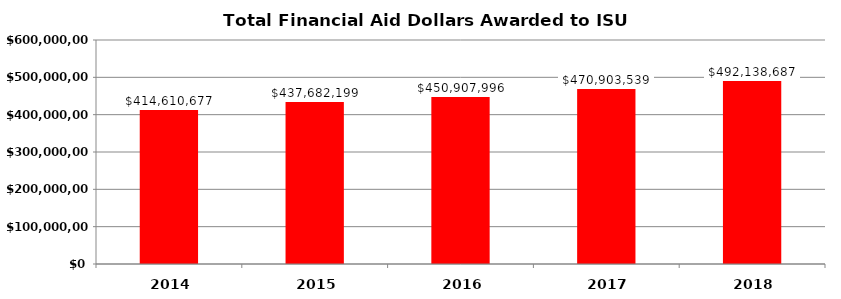
| Category | Total Amount Awarded |
|---|---|
| 2014.0 | 414610677 |
| 2015.0 | 437682199 |
| 2016.0 | 450907996 |
| 2017.0 | 470903539 |
| 2018.0 | 492138687 |